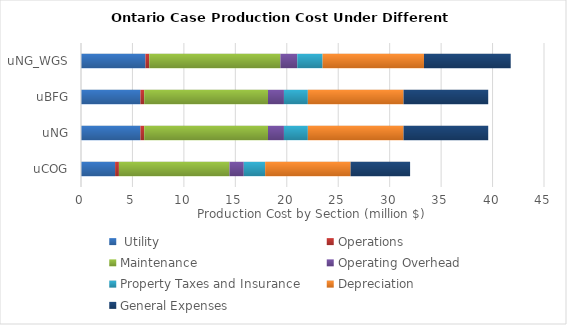
| Category |  Utility  | Operations | Maintenance  | Operating Overhead  | Property Taxes and Insurance | Depreciation | General Expenses |
|---|---|---|---|---|---|---|---|
| uCOG | 3.314 | 0.371 | 10.745 | 1.39 | 2.076 | 8.306 | 5.783 |
| uNG | 5.774 | 0.371 | 12.03 | 1.549 | 2.325 | 9.299 | 8.23 |
| uBFG | 5.774 | 0.371 | 12.03 | 1.549 | 2.325 | 9.299 | 8.23 |
| uNG_WGS | 6.261 | 0.371 | 12.747 | 1.638 | 2.463 | 9.853 | 8.431 |